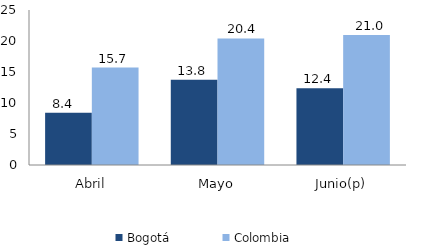
| Category | Bogotá | Colombia |
|---|---|---|
| Abril | 8.446 | 15.718 |
| Mayo | 13.765 | 20.415 |
| Junio(p) | 12.37 | 20.977 |